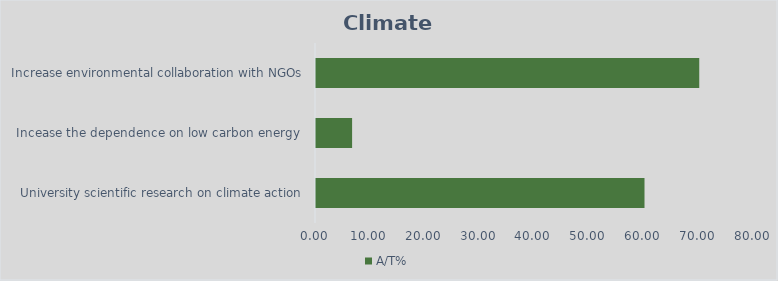
| Category | A/T% |
|---|---|
| University scientific research on climate action | 60 |
| Incease the dependence on low carbon energy  | 6.594 |
| Increase environmental collaboration with NGOs | 70 |